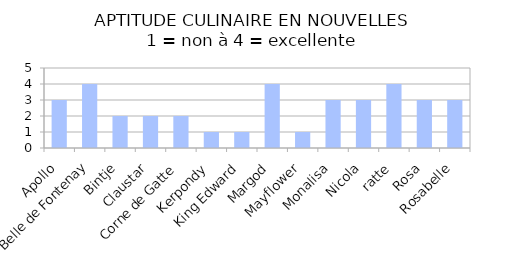
| Category | primeur |
|---|---|
| Apollo | 3 |
| Belle de Fontenay | 4 |
| Bintje | 2 |
| Claustar | 2 |
| Corne de Gatte | 2 |
| Kerpondy | 1 |
| King Edward | 1 |
| Margod  | 4 |
| Mayflower  | 1 |
| Monalisa | 3 |
| Nicola | 3 |
| ratte | 4 |
| Rosa | 3 |
| Rosabelle | 3 |